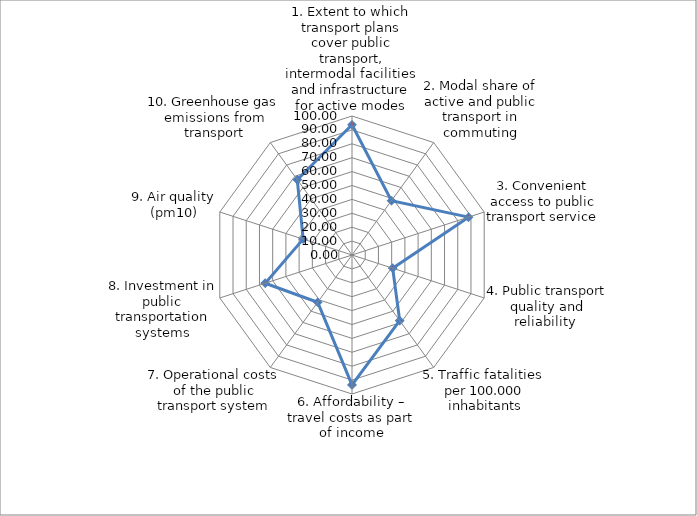
| Category | Series 0 |
|---|---|
| 1. Extent to which transport plans cover public transport, intermodal facilities and infrastructure for active modes | 93.75 |
| 2. Modal share of active and public transport in commuting | 48.242 |
| 3. Convenient access to public transport service | 88.156 |
| 4. Public transport quality and reliability  | 30.769 |
| 5. Traffic fatalities  per 100.000 inhabitants | 58.377 |
| 6. Affordability – travel costs as part of income | 93.425 |
| 7. Operational costs of the public transport system | 42.018 |
| 8. Investment in public transportation systems | 65.668 |
| 9. Air quality (pm10) | 36.955 |
| 10. Greenhouse gas emissions from transport | 66.977 |